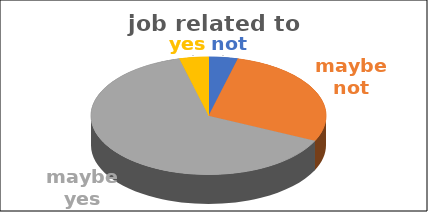
| Category | job related to studies | Series 1 | Series 2 | Series 3 | Series 4 |
|---|---|---|---|---|---|
| not | 0.04 |  |  |  |  |
| maybe not | 0.28 |  |  |  |  |
| maybe yes | 0.64 |  |  |  |  |
| yes | 0.04 |  |  |  |  |